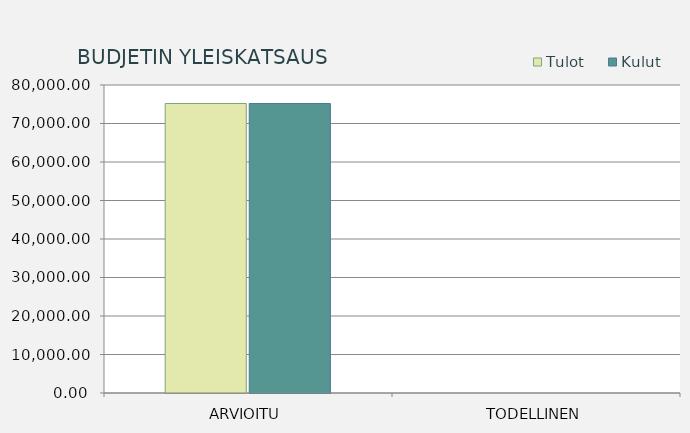
| Category | Tulot | Kulut |
|---|---|---|
| ARVIOITU | 75193 | 75193 |
| TODELLINEN | 0 | 0 |